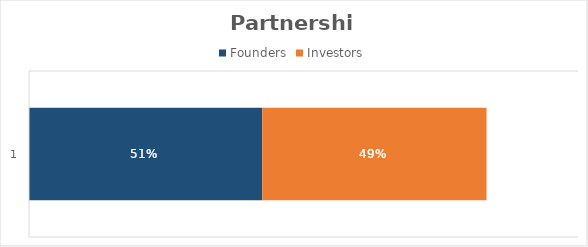
| Category | Founders | Investors |
|---|---|---|
| 0 | 0.51 | 0.49 |